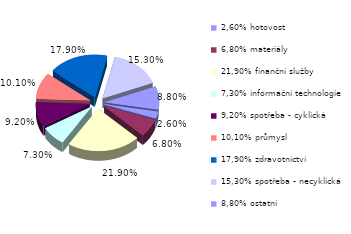
| Category | Series 0 |
|---|---|
| 2,60% hotovost | 0.026 |
| 6,80% materiály | 0.068 |
| 21,90% finanční služby | 0.219 |
| 7,30% informační technologie | 0.073 |
| 9,20% spotřeba - cyklická | 0.092 |
| 10,10% průmysl | 0.101 |
| 17,90% zdravotnictví | 0.179 |
| 15,30% spotřeba - necyklická | 0.153 |
| 8,80% ostatní | 0.088 |